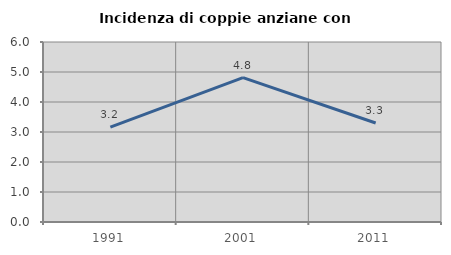
| Category | Incidenza di coppie anziane con figli |
|---|---|
| 1991.0 | 3.163 |
| 2001.0 | 4.811 |
| 2011.0 | 3.301 |